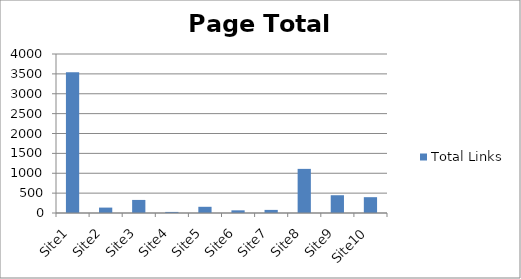
| Category | Total Links |
|---|---|
| Site1 | 3539 |
| Site2 | 136 |
| Site3 | 329 |
| Site4 | 27 |
| Site5 | 156 |
| Site6 | 67 |
| Site7 | 78 |
| Site8 | 1110 |
| Site9 | 447 |
| Site10 | 398 |